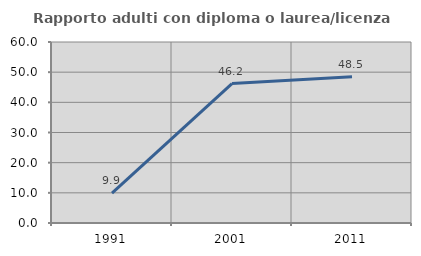
| Category | Rapporto adulti con diploma o laurea/licenza media  |
|---|---|
| 1991.0 | 9.877 |
| 2001.0 | 46.237 |
| 2011.0 | 48.454 |